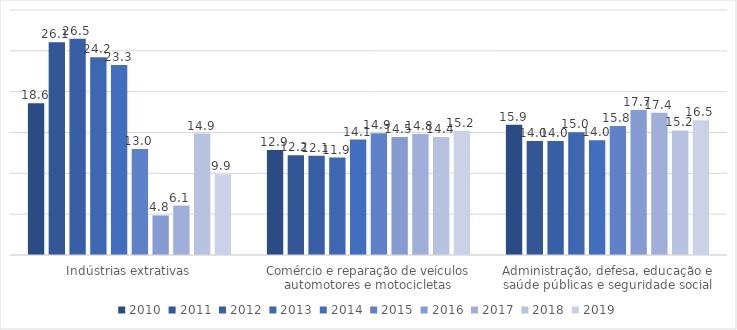
| Category | 2010 | 2011 | 2012 | 2013 | 2014 | 2015 | 2016 | 2017 | 2018 | 2019 |
|---|---|---|---|---|---|---|---|---|---|---|
| Indústrias extrativas | 18.586 | 26.059 | 26.468 | 24.216 | 23.268 | 12.988 | 4.846 | 6.051 | 14.873 | 9.891 |
| Comércio e reparação de veículos automotores e motocicletas | 12.85 | 12.218 | 12.143 | 11.932 | 14.136 | 14.899 | 14.455 | 14.818 | 14.444 | 15.229 |
| Administração, defesa, educação e saúde públicas e seguridade social | 15.945 | 13.965 | 13.967 | 15.031 | 14.04 | 15.799 | 17.748 | 17.418 | 15.247 | 16.507 |